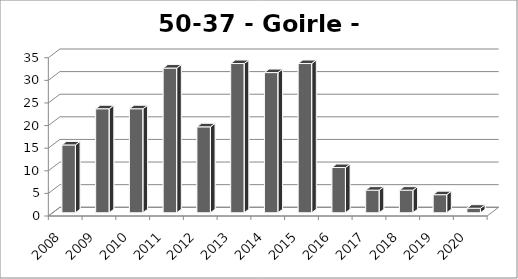
| Category | Goirle- Breehees |
|---|---|
| 2008.0 | 15 |
| 2009.0 | 23 |
| 2010.0 | 23 |
| 2011.0 | 32 |
| 2012.0 | 19 |
| 2013.0 | 33 |
| 2014.0 | 31 |
| 2015.0 | 33 |
| 2016.0 | 10 |
| 2017.0 | 5 |
| 2018.0 | 5 |
| 2019.0 | 4 |
| 2020.0 | 1 |